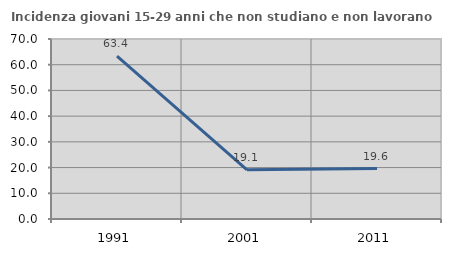
| Category | Incidenza giovani 15-29 anni che non studiano e non lavorano  |
|---|---|
| 1991.0 | 63.366 |
| 2001.0 | 19.127 |
| 2011.0 | 19.63 |